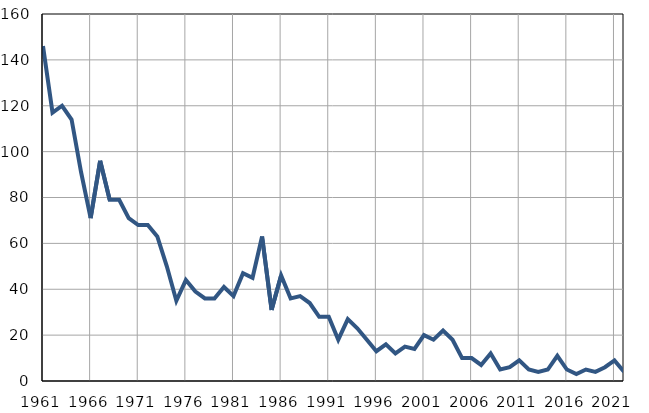
| Category | Infants
deaths |
|---|---|
| 1961.0 | 146 |
| 1962.0 | 117 |
| 1963.0 | 120 |
| 1964.0 | 114 |
| 1965.0 | 91 |
| 1966.0 | 71 |
| 1967.0 | 96 |
| 1968.0 | 79 |
| 1969.0 | 79 |
| 1970.0 | 71 |
| 1971.0 | 68 |
| 1972.0 | 68 |
| 1973.0 | 63 |
| 1974.0 | 50 |
| 1975.0 | 35 |
| 1976.0 | 44 |
| 1977.0 | 39 |
| 1978.0 | 36 |
| 1979.0 | 36 |
| 1980.0 | 41 |
| 1981.0 | 37 |
| 1982.0 | 47 |
| 1983.0 | 45 |
| 1984.0 | 63 |
| 1985.0 | 31 |
| 1986.0 | 46 |
| 1987.0 | 36 |
| 1988.0 | 37 |
| 1989.0 | 34 |
| 1990.0 | 28 |
| 1991.0 | 28 |
| 1992.0 | 18 |
| 1993.0 | 27 |
| 1994.0 | 23 |
| 1995.0 | 18 |
| 1996.0 | 13 |
| 1997.0 | 16 |
| 1998.0 | 12 |
| 1999.0 | 15 |
| 2000.0 | 14 |
| 2001.0 | 20 |
| 2002.0 | 18 |
| 2003.0 | 22 |
| 2004.0 | 18 |
| 2005.0 | 10 |
| 2006.0 | 10 |
| 2007.0 | 7 |
| 2008.0 | 12 |
| 2009.0 | 5 |
| 2010.0 | 6 |
| 2011.0 | 9 |
| 2012.0 | 5 |
| 2013.0 | 4 |
| 2014.0 | 5 |
| 2015.0 | 11 |
| 2016.0 | 5 |
| 2017.0 | 3 |
| 2018.0 | 5 |
| 2019.0 | 4 |
| 2020.0 | 6 |
| 2021.0 | 9 |
| 2022.0 | 4 |